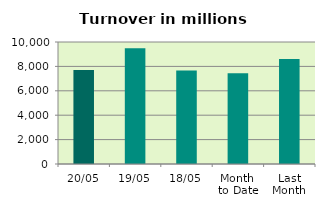
| Category | Series 0 |
|---|---|
| 20/05 | 7698.215 |
| 19/05 | 9489.317 |
| 18/05 | 7655.332 |
| Month 
to Date | 7433.843 |
| Last
Month | 8604.869 |